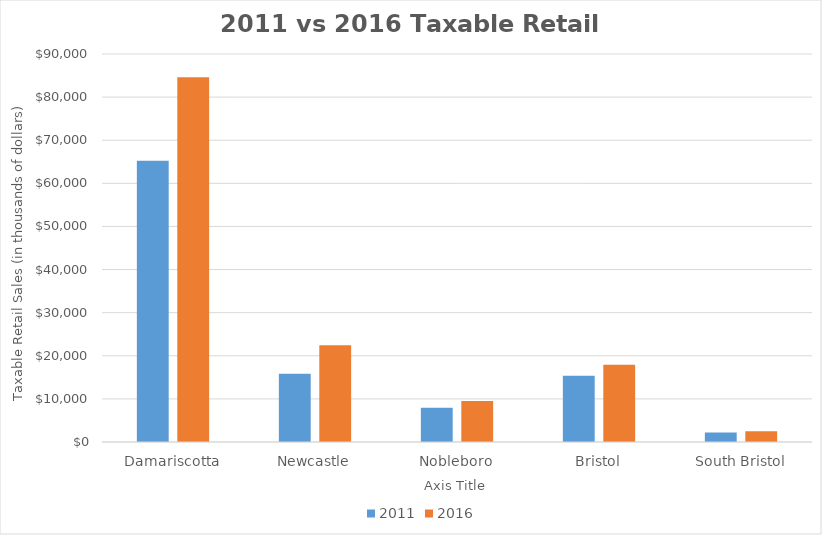
| Category | 2011 | 2016 |
|---|---|---|
| Damariscotta | 65223.1 | 84592.7 |
| Newcastle | 15806 | 22436.4 |
| Nobleboro | 7945.2 | 9507 |
| Bristol | 15363.3 | 17945.4 |
| South Bristol | 2227.4 | 2469.6 |